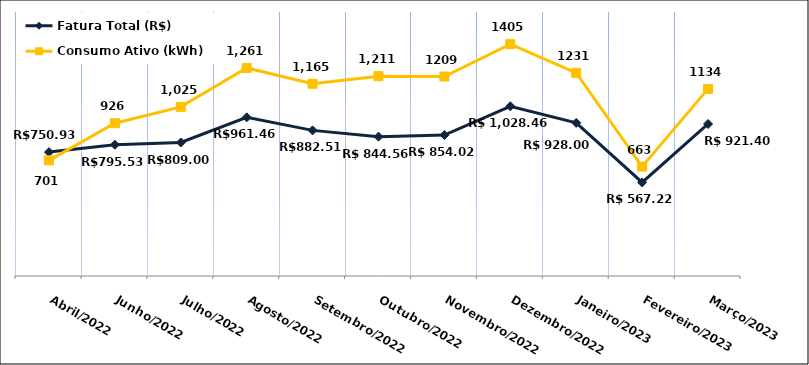
| Category | Fatura Total (R$) |
|---|---|
| Abril/2022 | 750.93 |
| Junho/2022 | 795.53 |
| Julho/2022 | 809 |
| Agosto/2022 | 961.46 |
| Setembro/2022 | 882.51 |
| Outubro/2022 | 844.56 |
| Novembro/2022 | 854.02 |
| Dezembro/2022 | 1028.46 |
| Janeiro/2023 | 928 |
| Fevereiro/2023 | 567.22 |
| Março/2023 | 921.4 |